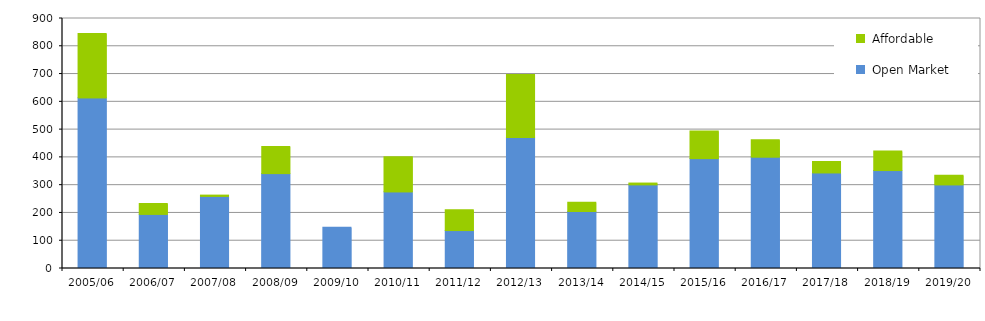
| Category |  Open Market |  Affordable |
|---|---|---|
| 2005/06 | 611 | 231 |
| 2006/07 | 192 | 38 |
| 2007/08 | 257 | 3 |
| 2008/09 | 338 | 98 |
| 2009/10 | 145 | 0 |
| 2010/11 | 273 | 126 |
| 2011/12 | 133 | 75 |
| 2012/13 | 468 | 227 |
| 2013/14 | 202 | 33 |
| 2014/15 | 298 | 6 |
| 2015/16 | 392 | 99 |
| 2016/17 | 398 | 62 |
| 2017/18 | 341 | 41 |
| 2018/19 | 349 | 70 |
| 2019/20 | 298 | 34 |